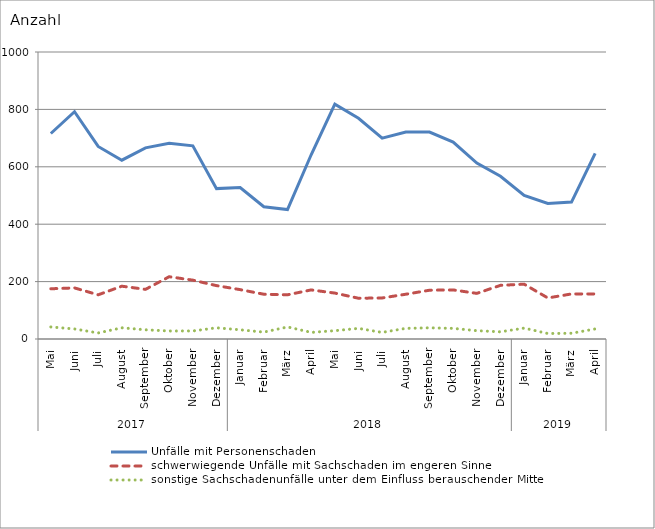
| Category | Unfälle mit Personenschaden | schwerwiegende Unfälle mit Sachschaden im engeren Sinne | sonstige Sachschadenunfälle unter dem Einfluss berauschender Mittel |
|---|---|---|---|
| 0 | 716 | 175 | 42 |
| 1 | 792 | 178 | 35 |
| 2 | 671 | 154 | 21 |
| 3 | 623 | 184 | 39 |
| 4 | 666 | 173 | 32 |
| 5 | 682 | 217 | 28 |
| 6 | 673 | 205 | 28 |
| 7 | 524 | 186 | 39 |
| 8 | 528 | 172 | 32 |
| 9 | 461 | 156 | 24 |
| 10 | 451 | 154 | 42 |
| 11 | 642 | 171 | 23 |
| 12 | 818 | 160 | 29 |
| 13 | 769 | 142 | 37 |
| 14 | 700 | 143 | 23 |
| 15 | 721 | 156 | 37 |
| 16 | 721 | 170 | 39 |
| 17 | 686 | 171 | 37 |
| 18 | 613 | 159 | 29 |
| 19 | 567 | 187 | 25 |
| 20 | 500 | 191 | 38 |
| 21 | 472 | 143 | 19 |
| 22 | 477 | 157 | 20 |
| 23 | 647 | 157 | 35 |